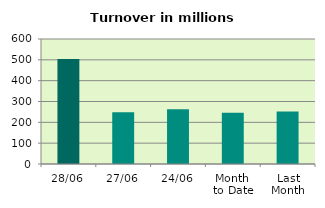
| Category | Series 0 |
|---|---|
| 28/06 | 504.085 |
| 27/06 | 248.748 |
| 24/06 | 263.195 |
| Month 
to Date | 245.862 |
| Last
Month | 251.573 |